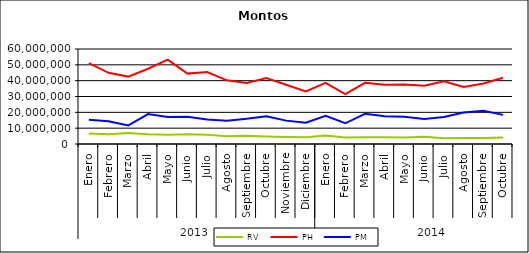
| Category | RV | PH | PM |
|---|---|---|---|
| 0 | 6603412.357 | 51097257.501 | 15291994.497 |
| 1 | 6144371.716 | 44938482.89 | 14418861.164 |
| 2 | 6870539.137 | 42574717.992 | 11735480.075 |
| 3 | 6139858.354 | 47535968.024 | 18924825.739 |
| 4 | 5890476.617 | 53273527.932 | 17047621.863 |
| 5 | 6142686.449 | 44450017.2 | 17254269.094 |
| 6 | 5792277.798 | 45481930.674 | 15546714.502 |
| 7 | 4962192.427 | 40196203.529 | 14644148.591 |
| 8 | 5244267.415 | 38549056.812 | 15946518.356 |
| 9 | 4723321.466 | 41614732.22 | 17536811.707 |
| 10 | 4437368.656 | 37439358.84 | 14761398.421 |
| 11 | 4226608.984 | 33178083.97 | 13384599.022 |
| 12 | 5420667.417 | 38592535.269 | 17738595.757 |
| 13 | 4106438.771 | 31549668.118 | 13082413.394 |
| 14 | 4333641.03 | 38643419.598 | 19107804.717 |
| 15 | 4275572.01 | 37358737.373 | 17555594.298 |
| 16 | 4139390.073 | 37637742.383 | 17146834.395 |
| 17 | 4553837.188 | 36763239.571 | 15771052.834 |
| 18 | 3703149.165 | 39606057.082 | 16994946.064 |
| 19 | 3782918.817 | 36051238.49 | 19934925.294 |
| 20 | 3865511.016 | 38158385.619 | 21028953.635 |
| 21 | 4039426.107 | 41798244.765 | 18387198.681 |